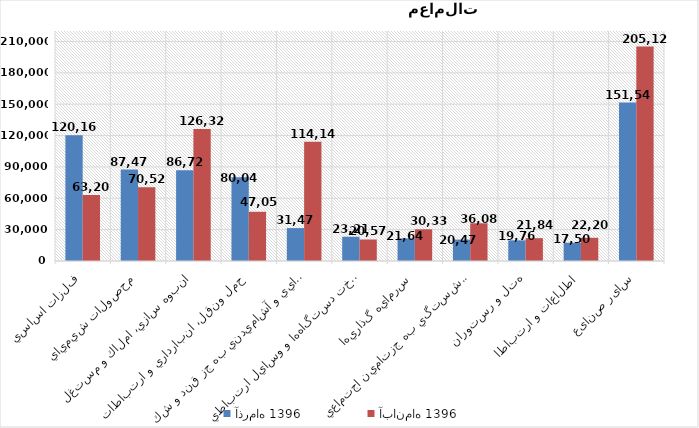
| Category | آذر‌ماه 1396 | آبان‌ماه 1396 |
|---|---|---|
| فلزات اساسي | 120164 | 63201 |
| محصولات شيميايي | 87475 | 70522 |
| انبوه سازي، املاك و مستغلات | 86723 | 126324 |
| حمل ونقل، انبارداري و ارتباطات | 80045 | 47054 |
| محصولات غذايي و آشاميدني به جز قند و شكر | 31478 | 114141 |
| ساخت دستگاه‌ها و وسايل ارتباطي | 23216 | 20575 |
| سرمايه گذاريها | 21646 | 30333 |
| بيمه وصندوق بازنشستگي به جزتامين اجتماعي | 20472 | 36087 |
| هتل و رستوران | 19764 | 21849 |
| اطلاعات و ارتباطات | 17505 | 22206 |
| سایر صنایع | 151540 | 205126 |